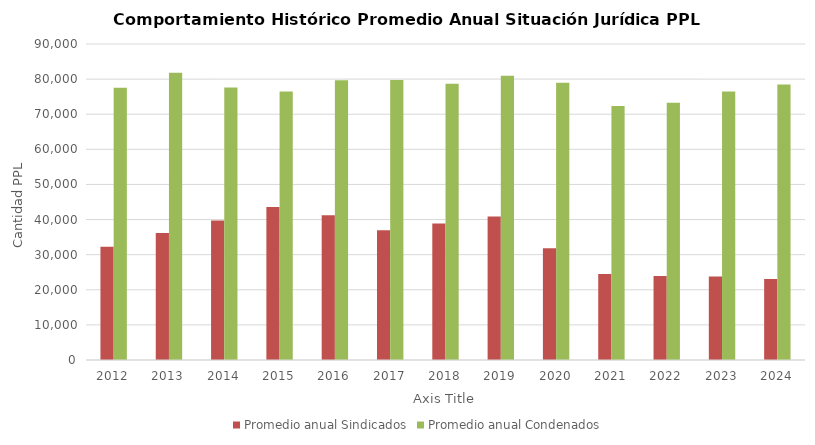
| Category | Promedio anual Sindicados | Promedio anual Condenados |
|---|---|---|
| 2012.0 | 32250.083 | 77572 |
| 2013.0 | 36194.167 | 81792.083 |
| 2014.0 | 39755 | 77634.083 |
| 2015.0 | 43545.833 | 76494.25 |
| 2016.0 | 41229.083 | 79684.917 |
| 2017.0 | 36925.5 | 79732.167 |
| 2018.0 | 38890.25 | 78679.333 |
| 2019.0 | 40870.083 | 80977.25 |
| 2020.0 | 31861.083 | 78969.25 |
| 2021.0 | 24484.417 | 72353.083 |
| 2022.0 | 23917.667 | 73258.25 |
| 2023.0 | 23757.25 | 76504.667 |
| 2024.0 | 23047.667 | 78468 |